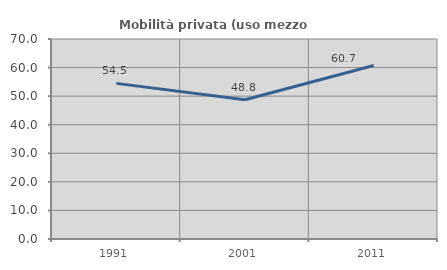
| Category | Mobilità privata (uso mezzo privato) |
|---|---|
| 1991.0 | 54.472 |
| 2001.0 | 48.763 |
| 2011.0 | 60.734 |